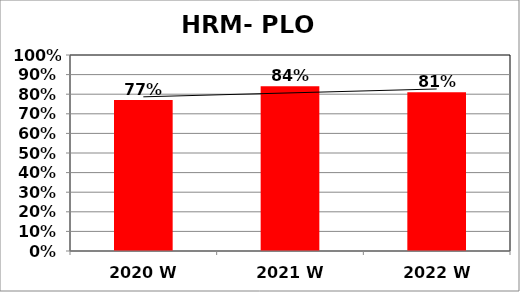
| Category | Series 0 |
|---|---|
| 2020 W | 0.77 |
| 2021 W | 0.84 |
| 2022 W | 0.81 |